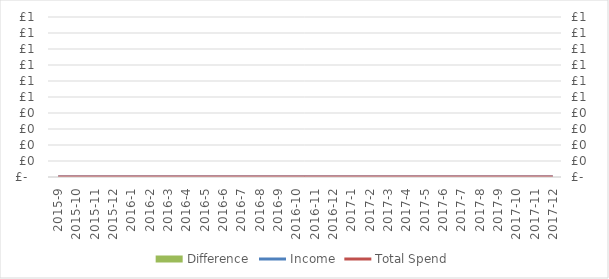
| Category | Difference |
|---|---|
| 2015-9 | 0 |
| 2015-10 | 0 |
| 2015-11 | 0 |
| 2015-12 | 0 |
| 2016-1 | 0 |
| 2016-2 | 0 |
| 2016-3 | 0 |
| 2016-4 | 0 |
| 2016-5 | 0 |
| 2016-6 | 0 |
| 2016-7 | 0 |
| 2016-8 | 0 |
| 2016-9 | 0 |
| 2016-10 | 0 |
| 2016-11 | 0 |
| 2016-12 | 0 |